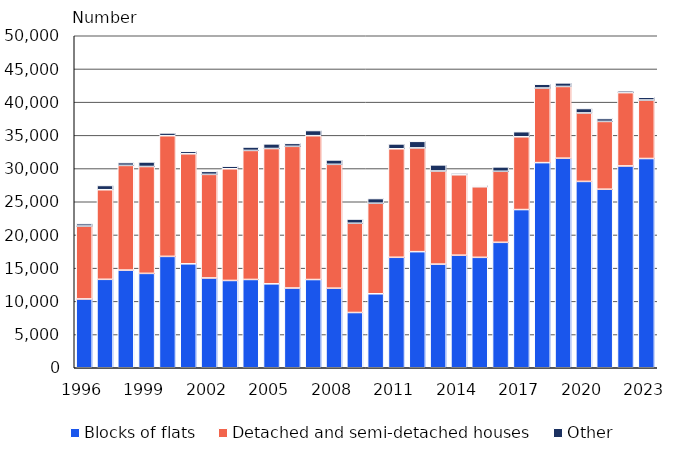
| Category | Blocks of flats | Detached and semi-detached houses | Other |
|---|---|---|---|
| 1996.0 | 10361 | 10976 | 366 |
| 1997.0 | 13318 | 13493 | 640 |
| 1998.0 | 14708 | 15767 | 425 |
| 1999.0 | 14211 | 16099 | 685 |
| 2000.0 | 16772 | 18173 | 420 |
| 2001.0 | 15655 | 16565 | 378 |
| 2002.0 | 13523 | 15602 | 454 |
| 2003.0 | 13146 | 16822 | 391 |
| 2004.0 | 13296 | 19435 | 513 |
| 2005.0 | 12639 | 20379 | 700 |
| 2006.0 | 12007 | 21340 | 445 |
| 2007.0 | 13287 | 21663 | 776 |
| 2008.0 | 11981 | 18657 | 658 |
| 2009.0 | 8320 | 13442 | 631 |
| 2010.0 | 11140 | 13638 | 704 |
| 2011.0 | 16635 | 16344 | 732 |
| 2012.0 | 17486 | 15623 | 990 |
| 2013.0 | 15607 | 14026 | 920 |
| 2014.0 | 16951 | 12109 | 263 |
| 2015.0 | 16628 | 10625 | 226 |
| 2016.0 | 18890 | 10700 | 660 |
| 2017.0 | 23825 | 10958 | 769 |
| 2018.0 | 30893 | 11232 | 579 |
| 2019.0 | 31559 | 10807 | 537 |
| 2020.0 | 28062 | 10313 | 667 |
| 2021.0 | 26887 | 10211 | 437 |
| 2022.0 | 30392 | 11041 | 277 |
| 2023.0 | 31513 | 8807 | 417 |